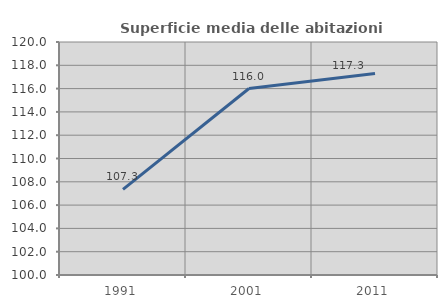
| Category | Superficie media delle abitazioni occupate |
|---|---|
| 1991.0 | 107.349 |
| 2001.0 | 116.005 |
| 2011.0 | 117.299 |